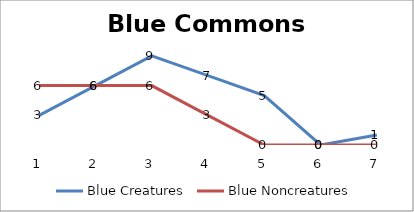
| Category | Blue Creatures | Blue Noncreatures |
|---|---|---|
| 0 | 3 | 6 |
| 1 | 6 | 6 |
| 2 | 9 | 6 |
| 3 | 7 | 3 |
| 4 | 5 | 0 |
| 5 | 0 | 0 |
| 6 | 1 | 0 |